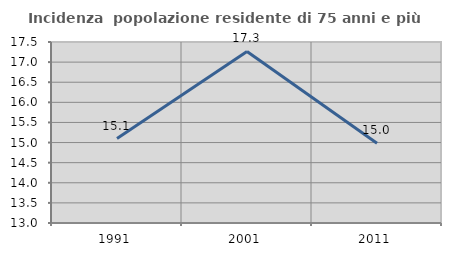
| Category | Incidenza  popolazione residente di 75 anni e più |
|---|---|
| 1991.0 | 15.101 |
| 2001.0 | 17.266 |
| 2011.0 | 14.981 |